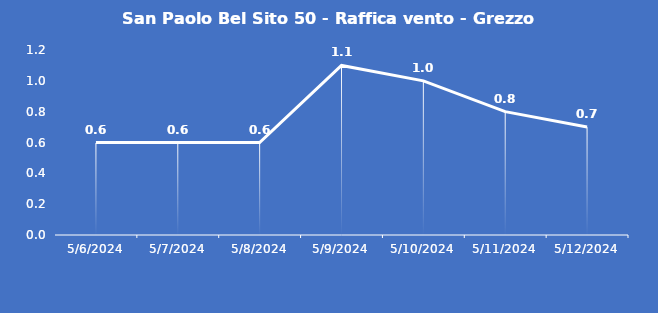
| Category | San Paolo Bel Sito 50 - Raffica vento - Grezzo (m/s) |
|---|---|
| 5/6/24 | 0.6 |
| 5/7/24 | 0.6 |
| 5/8/24 | 0.6 |
| 5/9/24 | 1.1 |
| 5/10/24 | 1 |
| 5/11/24 | 0.8 |
| 5/12/24 | 0.7 |